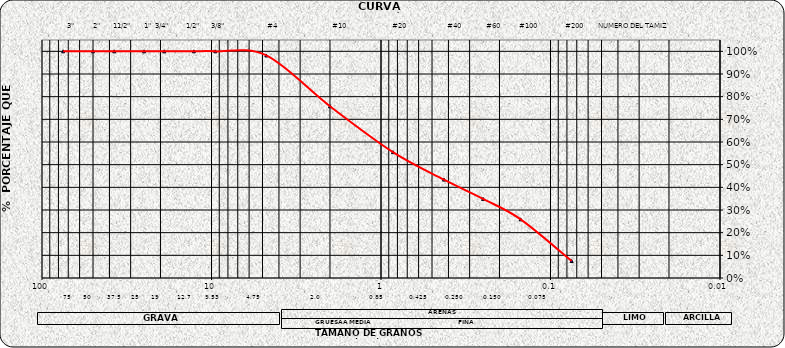
| Category | Series 0 |
|---|---|
| 75.0 | 1 |
| 50.0 | 1 |
| 37.5 | 1 |
| 25.0 | 1 |
| 19.0 | 1 |
| 12.7 | 1 |
| 9.5 | 1 |
| 4.75 | 0.982 |
| 2.0 | 0.758 |
| 0.85 | 0.555 |
| 0.425 | 0.434 |
| 0.25 | 0.349 |
| 0.15 | 0.259 |
| 0.075 | 0.075 |
| nan | 0 |